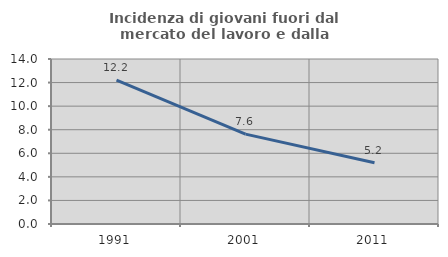
| Category | Incidenza di giovani fuori dal mercato del lavoro e dalla formazione  |
|---|---|
| 1991.0 | 12.199 |
| 2001.0 | 7.629 |
| 2011.0 | 5.19 |